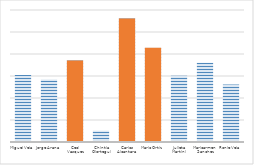
| Category | Series 0 | Top 3 |
|---|---|---|
| Miguel Vela | 152000 | 0 |
| Jorge Arana | 142000 | 0 |
| Ceci Vasquez | 185000 | 185000 |
| Chintia Olortegui | 25800 | 0 |
| Carlos Alcantara | 280400 | 280400 |
| Mario Ortíz | 214000 | 214000 |
| Julieta Martini | 150444 | 0 |
| Maricarmen Sanchez | 180222 | 0 |
| Ronie Vela | 130555 | 0 |